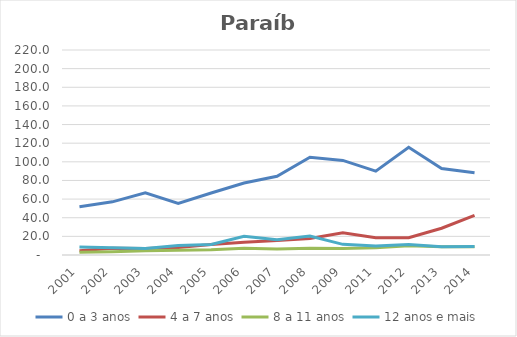
| Category | 0 a 3 anos | 4 a 7 anos | 8 a 11 anos | 12 anos e mais |
|---|---|---|---|---|
| 2001.0 | 51.789 | 4.534 | 2.895 | 8.675 |
| 2002.0 | 57.05 | 7.293 | 3.567 | 7.911 |
| 2003.0 | 66.641 | 7.029 | 4.478 | 7.082 |
| 2004.0 | 55.464 | 8.104 | 5.074 | 10.168 |
| 2005.0 | 66.567 | 11.246 | 5.684 | 11.303 |
| 2006.0 | 77.212 | 13.754 | 7.174 | 20.178 |
| 2007.0 | 84.452 | 15.666 | 6.487 | 16.292 |
| 2008.0 | 104.987 | 17.722 | 7.3 | 20.261 |
| 2009.0 | 101.482 | 23.946 | 7.075 | 11.433 |
| 2011.0 | 89.999 | 18.592 | 7.764 | 9.551 |
| 2012.0 | 115.636 | 18.545 | 9.933 | 11.158 |
| 2013.0 | 92.849 | 28.758 | 8.817 | 8.791 |
| 2014.0 | 88.263 | 42.446 | 8.736 | 9.059 |